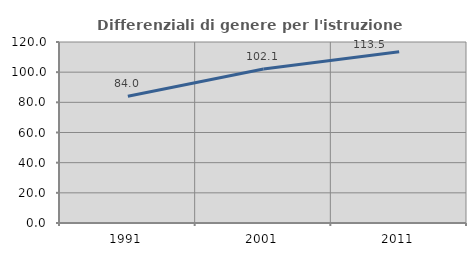
| Category | Differenziali di genere per l'istruzione superiore |
|---|---|
| 1991.0 | 84.015 |
| 2001.0 | 102.094 |
| 2011.0 | 113.506 |